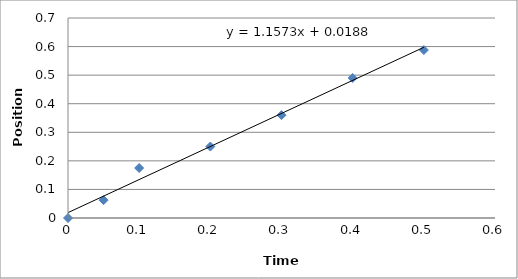
| Category | T^2 |
|---|---|
| 0.0 | 0 |
| 0.05 | 0.062 |
| 0.1 | 0.175 |
| 0.2 | 0.25 |
| 0.3 | 0.36 |
| 0.4 | 0.49 |
| 0.5 | 0.588 |